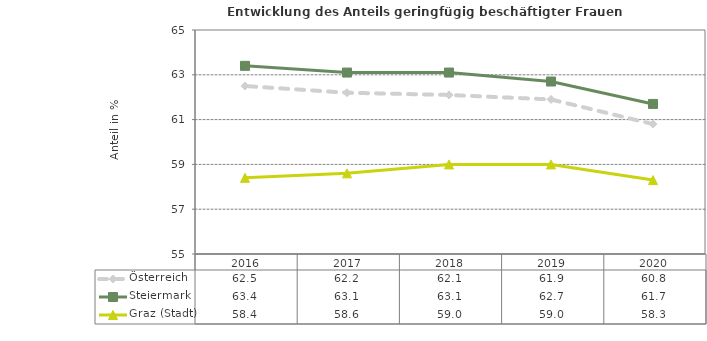
| Category | Österreich | Steiermark | Graz (Stadt) |
|---|---|---|---|
| 2020.0 | 60.8 | 61.7 | 58.3 |
| 2019.0 | 61.9 | 62.7 | 59 |
| 2018.0 | 62.1 | 63.1 | 59 |
| 2017.0 | 62.2 | 63.1 | 58.6 |
| 2016.0 | 62.5 | 63.4 | 58.4 |